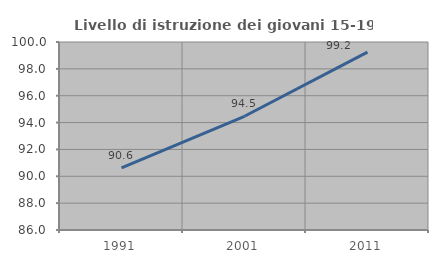
| Category | Livello di istruzione dei giovani 15-19 anni |
|---|---|
| 1991.0 | 90.627 |
| 2001.0 | 94.47 |
| 2011.0 | 99.247 |